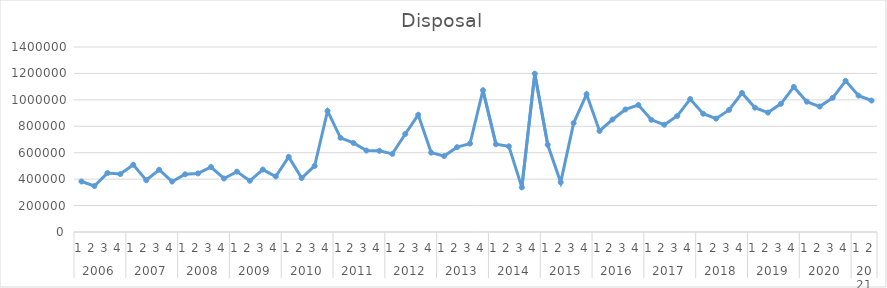
| Category | Disposal |
|---|---|
| 0 | 382404 |
| 1 | 348224 |
| 2 | 445622 |
| 3 | 438524 |
| 4 | 508848 |
| 5 | 392491 |
| 6 | 471125 |
| 7 | 381799 |
| 8 | 436735 |
| 9 | 443400 |
| 10 | 491723 |
| 11 | 404934 |
| 12 | 456766 |
| 13 | 387628 |
| 14 | 472561 |
| 15 | 420316 |
| 16 | 568668 |
| 17 | 408207 |
| 18 | 499689 |
| 19 | 916099 |
| 20 | 713032 |
| 21 | 673726 |
| 22 | 616745 |
| 23 | 614642 |
| 24 | 591019 |
| 25 | 741768 |
| 26 | 886524 |
| 27 | 600799 |
| 28 | 574890 |
| 29 | 641929 |
| 30 | 669179 |
| 31 | 1072888 |
| 32 | 664313 |
| 33 | 648286 |
| 34 | 337429 |
| 35 | 1198058 |
| 36 | 659851 |
| 37 | 375816 |
| 38 | 824243 |
| 39 | 1042907 |
| 40 | 764733 |
| 41 | 851335 |
| 42 | 927388 |
| 43 | 960665.507 |
| 44 | 849098.716 |
| 45 | 811966.989 |
| 46 | 878277.716 |
| 47 | 1006405.308 |
| 48 | 894838.518 |
| 49 | 857706.79 |
| 50 | 924017.518 |
| 51 | 1052145.109 |
| 52 | 940578.319 |
| 53 | 903446.592 |
| 54 | 969757.319 |
| 55 | 1097884.91 |
| 56 | 986318.12 |
| 57 | 949186.393 |
| 58 | 1015497.12 |
| 59 | 1143624.712 |
| 60 | 1032057.921 |
| 61 | 994926.194 |